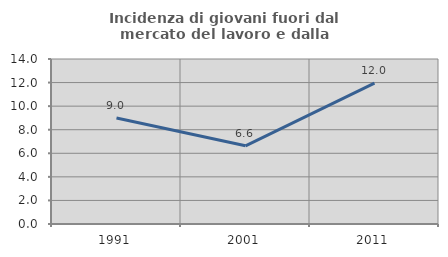
| Category | Incidenza di giovani fuori dal mercato del lavoro e dalla formazione  |
|---|---|
| 1991.0 | 8.996 |
| 2001.0 | 6.637 |
| 2011.0 | 11.957 |